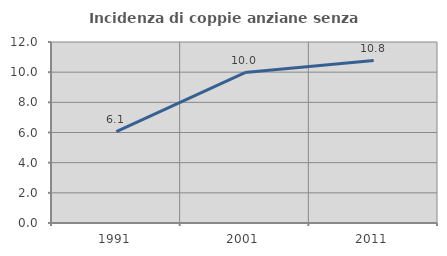
| Category | Incidenza di coppie anziane senza figli  |
|---|---|
| 1991.0 | 6.052 |
| 2001.0 | 9.973 |
| 2011.0 | 10.769 |